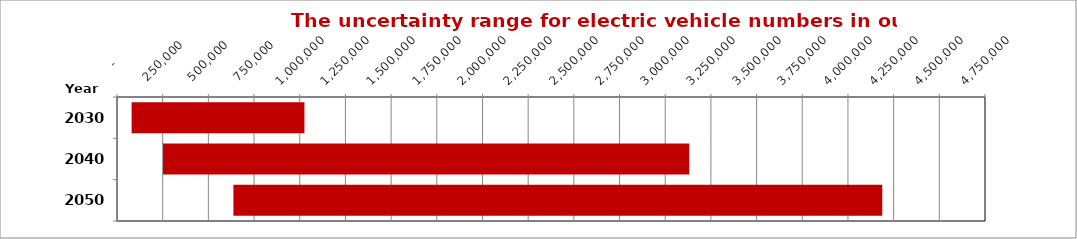
| Category | Min | Inc |
|---|---|---|
| 2030.0 | 79925 | 945772 |
| 2040.0 | 251885 | 2879722 |
| 2050.0 | 637117 | 3550721 |